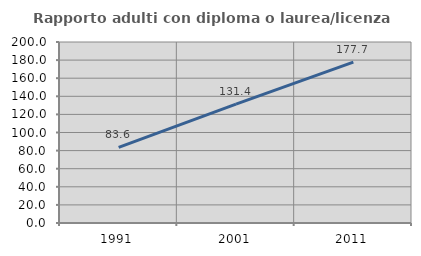
| Category | Rapporto adulti con diploma o laurea/licenza media  |
|---|---|
| 1991.0 | 83.626 |
| 2001.0 | 131.4 |
| 2011.0 | 177.698 |